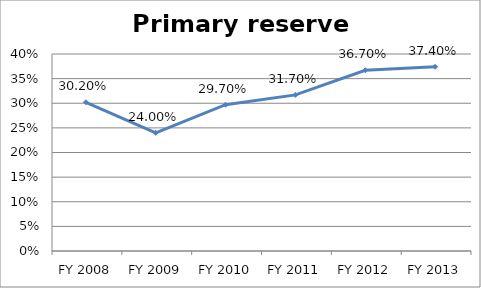
| Category | Primary reserve ratio |
|---|---|
| FY 2013 | 0.374 |
| FY 2012 | 0.367 |
| FY 2011 | 0.317 |
| FY 2010 | 0.297 |
| FY 2009 | 0.24 |
| FY 2008 | 0.302 |